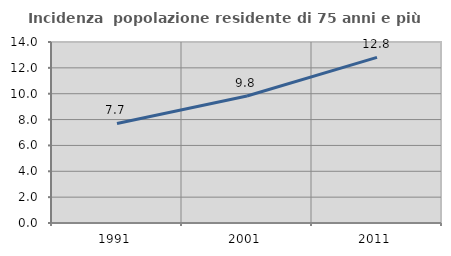
| Category | Incidenza  popolazione residente di 75 anni e più |
|---|---|
| 1991.0 | 7.7 |
| 2001.0 | 9.822 |
| 2011.0 | 12.807 |